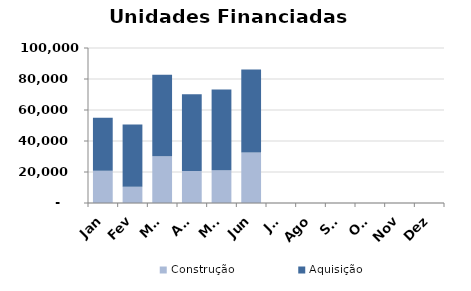
| Category | Construção | Aquisição  |
|---|---|---|
| Jan | 20845 | 34206 |
| Fev | 10499 | 40213 |
| Mar | 30238 | 52447 |
| Abr | 20667 | 49477 |
| Mai | 21176 | 51989 |
| Jun | 32589 | 53600 |
| Jul | 0 | 0 |
| Ago | 0 | 0 |
| Set | 0 | 0 |
| Out | 0 | 0 |
| Nov | 0 | 0 |
| Dez | 0 | 0 |